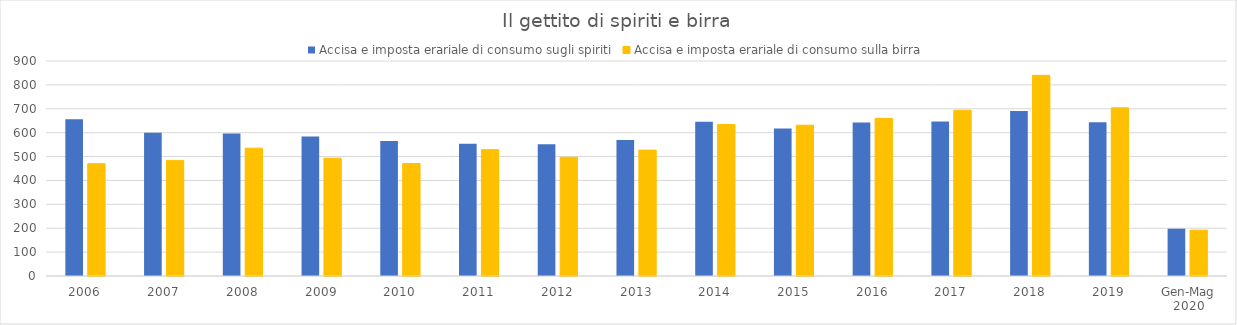
| Category | Accisa e imposta erariale di consumo sugli spiriti | Accisa e imposta erariale di consumo sulla birra |
|---|---|---|
| 2006 | 656 | 470 |
| 2007 | 600 | 484 |
| 2008 | 596 | 535 |
| 2009 | 584 | 493 |
| 2010 | 565 | 471 |
| 2011 | 554 | 529 |
| 2012 | 551 | 497 |
| 2013 | 569 | 527 |
| 2014 | 646 | 634 |
| 2015 | 617 | 631 |
| 2016 | 643 | 660 |
| 2017 | 647 | 694 |
| 2018 | 691 | 840 |
| 2019 | 644 | 704 |
| Gen-Mag 2020 | 198 | 192 |